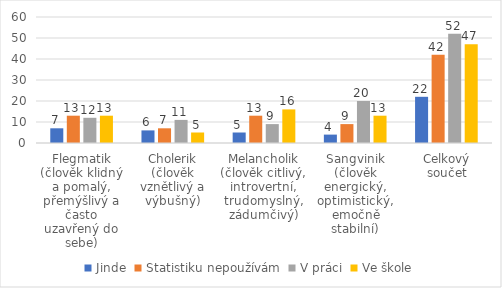
| Category | Jinde | Statistiku nepoužívám | V práci | Ve škole |
|---|---|---|---|---|
| Flegmatik (člověk klidný a pomalý, přemýšlivý a často uzavřený do sebe) | 7 | 13 | 12 | 13 |
| Cholerik (člověk vznětlivý a výbušný) | 6 | 7 | 11 | 5 |
| Melancholik (člověk citlivý, introvertní, trudomyslný, zádumčivý) | 5 | 13 | 9 | 16 |
| Sangvinik (člověk energický, optimistický, emočně stabilní) | 4 | 9 | 20 | 13 |
| Celkový součet | 22 | 42 | 52 | 47 |